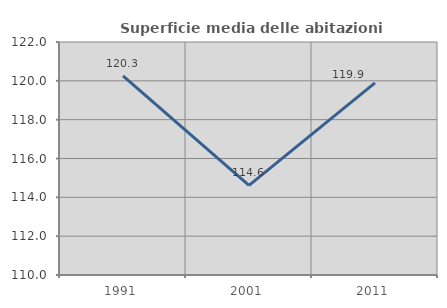
| Category | Superficie media delle abitazioni occupate |
|---|---|
| 1991.0 | 120.261 |
| 2001.0 | 114.615 |
| 2011.0 | 119.896 |